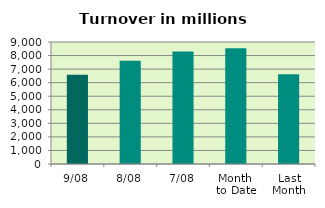
| Category | Series 0 |
|---|---|
| 9/08 | 6581.675 |
| 8/08 | 7612.256 |
| 7/08 | 8298.039 |
| Month 
to Date | 8542.373 |
| Last
Month | 6625.077 |